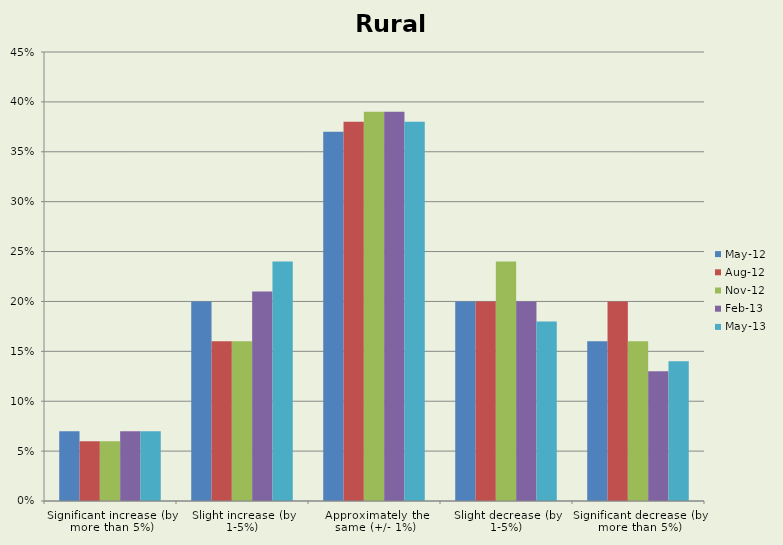
| Category | May-12 | Aug-12 | Nov-12 | Feb-13 | May-13 |
|---|---|---|---|---|---|
| Significant increase (by more than 5%) | 0.07 | 0.06 | 0.06 | 0.07 | 0.07 |
| Slight increase (by 1-5%) | 0.2 | 0.16 | 0.16 | 0.21 | 0.24 |
| Approximately the same (+/- 1%) | 0.37 | 0.38 | 0.39 | 0.39 | 0.38 |
| Slight decrease (by 1-5%) | 0.2 | 0.2 | 0.24 | 0.2 | 0.18 |
| Significant decrease (by more than 5%) | 0.16 | 0.2 | 0.16 | 0.13 | 0.14 |